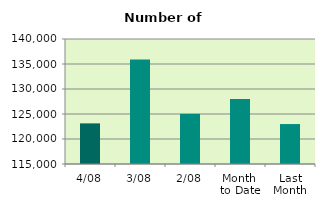
| Category | Series 0 |
|---|---|
| 4/08 | 123126 |
| 3/08 | 135904 |
| 2/08 | 125022 |
| Month 
to Date | 128017.333 |
| Last
Month | 122991 |